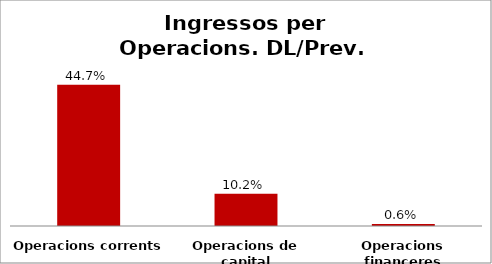
| Category | Series 0 |
|---|---|
| Operacions corrents | 0.447 |
| Operacions de capital | 0.102 |
| Operacions financeres | 0.006 |